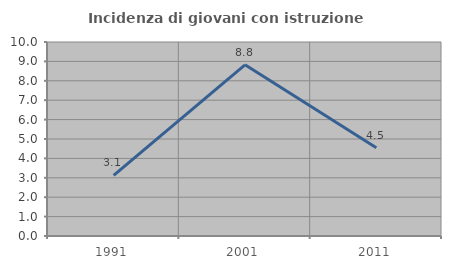
| Category | Incidenza di giovani con istruzione universitaria |
|---|---|
| 1991.0 | 3.125 |
| 2001.0 | 8.824 |
| 2011.0 | 4.545 |